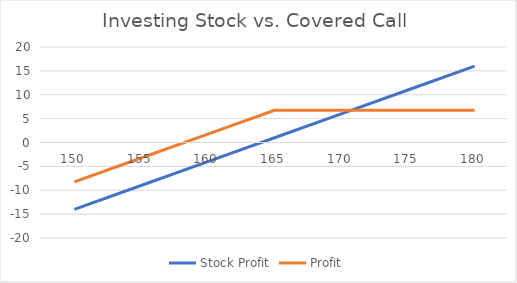
| Category | Stock Profit | Profit |
|---|---|---|
| 150.0 | -14 | -8.25 |
| 155.0 | -9 | -3.25 |
| 160.0 | -4 | 1.75 |
| 165.0 | 1 | 6.75 |
| 170.0 | 6 | 6.75 |
| 175.0 | 11 | 6.75 |
| 180.0 | 16 | 6.75 |